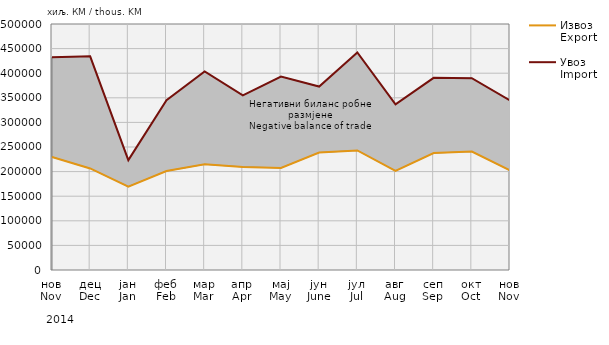
| Category | Извоз
Export | Увоз
Import |
|---|---|---|
| нов
Nov | 229828 | 432236 |
| дец
Dec | 206415 | 434262 |
| јан
Jan | 169611 | 223273 |
| феб
Feb | 201203 | 345220 |
| мар
Mar | 214811 | 403648 |
| апр
Apr | 209561 | 355008 |
| мај
May | 207541 | 393112 |
| јун
June | 238678 | 372846 |
| јул
Jul | 243048 | 442035 |
| авг
Aug | 201596 | 336534 |
| сеп
Sep | 237616 | 390519 |
| окт
Oct | 240797 | 389912 |
| нов
Nov | 202399 | 344727 |